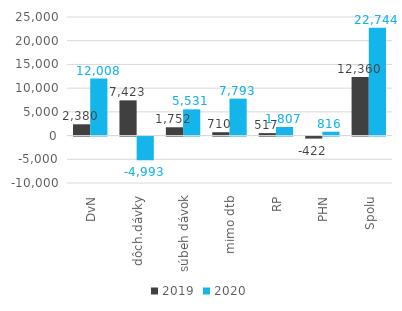
| Category | 2019 | 2020 |
|---|---|---|
| DvN | 2379.667 | 12008.417 |
| dôch.dávky | 7423.25 | -4993 |
| súbeh dávok | 1751.75 | 5531.25 |
| mimo dtb | 709.5 | 7792.5 |
| RP | 517.167 | 1807.273 |
| PHN | -421.833 | 816 |
| Spolu | 12359.5 | 22743.833 |